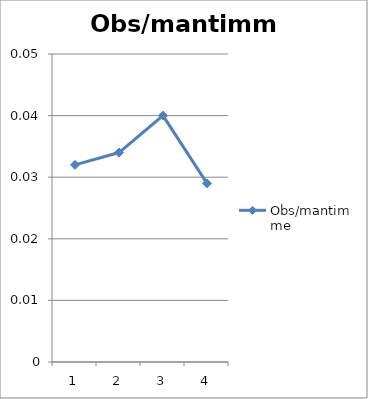
| Category | Obs/mantimme |
|---|---|
| 0 | 0.032 |
| 1 | 0.034 |
| 2 | 0.04 |
| 3 | 0.029 |